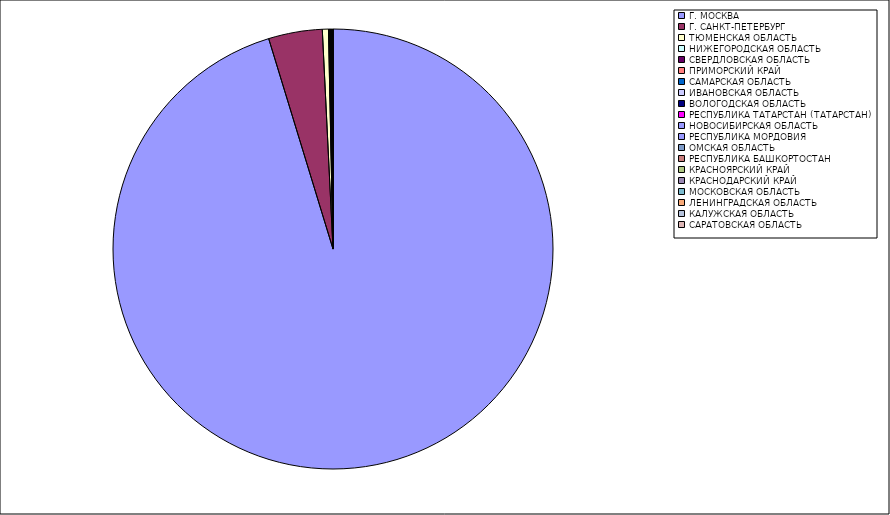
| Category | Оборот |
|---|---|
| Г. МОСКВА | 95.23 |
| Г. САНКТ-ПЕТЕРБУРГ | 3.944 |
| ТЮМЕНСКАЯ ОБЛАСТЬ | 0.448 |
| НИЖЕГОРОДСКАЯ ОБЛАСТЬ | 0.056 |
| СВЕРДЛОВСКАЯ ОБЛАСТЬ | 0.055 |
| ПРИМОРСКИЙ КРАЙ | 0.039 |
| САМАРСКАЯ ОБЛАСТЬ | 0.023 |
| ИВАНОВСКАЯ ОБЛАСТЬ | 0.021 |
| ВОЛОГОДСКАЯ ОБЛАСТЬ | 0.016 |
| РЕСПУБЛИКА ТАТАРСТАН (ТАТАРСТАН) | 0.016 |
| НОВОСИБИРСКАЯ ОБЛАСТЬ | 0.015 |
| РЕСПУБЛИКА МОРДОВИЯ | 0.015 |
| ОМСКАЯ ОБЛАСТЬ | 0.013 |
| РЕСПУБЛИКА БАШКОРТОСТАН | 0.012 |
| КРАСНОЯРСКИЙ КРАЙ | 0.012 |
| КРАСНОДАРСКИЙ КРАЙ | 0.011 |
| МОСКОВСКАЯ ОБЛАСТЬ | 0.008 |
| ЛЕНИНГРАДСКАЯ ОБЛАСТЬ | 0.006 |
| КАЛУЖСКАЯ ОБЛАСТЬ | 0.006 |
| САРАТОВСКАЯ ОБЛАСТЬ | 0.005 |